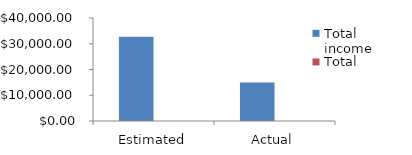
| Category | Total income | Total expenses |
|---|---|---|
| Estimated | 32750 | 0 |
| Actual | 14910 | 0 |